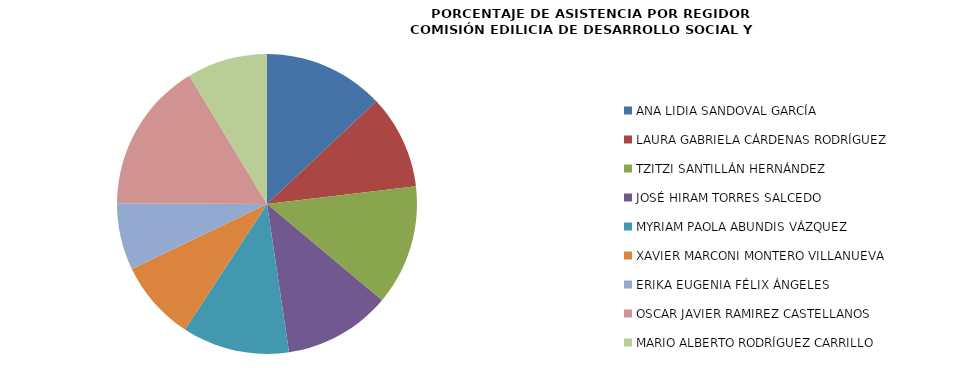
| Category | Series 0 |
|---|---|
| ANA LIDIA SANDOVAL GARCÍA | 100 |
| LAURA GABRIELA CÁRDENAS RODRÍGUEZ | 77.778 |
| TZITZI SANTILLÁN HERNÁNDEZ | 100 |
| JOSÉ HIRAM TORRES SALCEDO | 88.889 |
| MYRIAM PAOLA ABUNDIS VÁZQUEZ | 88.889 |
| XAVIER MARCONI MONTERO VILLANUEVA | 66.667 |
| ERIKA EUGENIA FÉLIX ÁNGELES | 55.556 |
| OSCAR JAVIER RAMIREZ CASTELLANOS | 125 |
| MARIO ALBERTO RODRÍGUEZ CARRILLO | 66.667 |